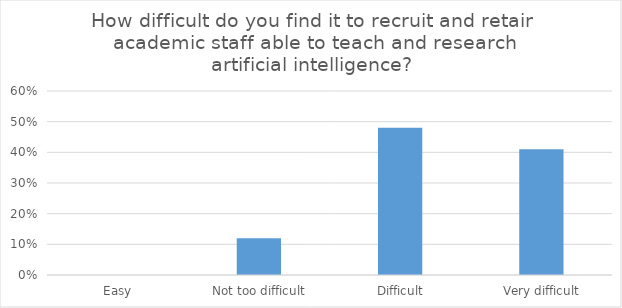
| Category | Series 0 |
|---|---|
|  Easy | 0 |
|  Not too difficult | 0.12 |
|  Difficult | 0.48 |
|  Very difficult | 0.41 |